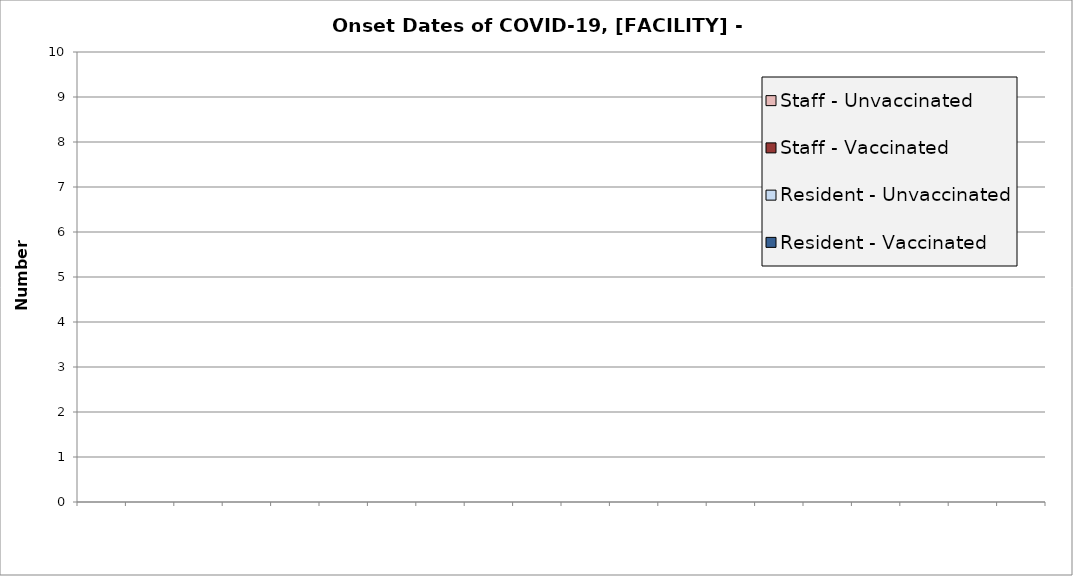
| Category | Resident - Vaccinated | Resident - Unvaccinated | Staff - Vaccinated | Staff - Unvaccinated |
|---|---|---|---|---|
|  | 0 | 0 | 0 | 0 |
|  | 0 | 0 | 0 | 0 |
|  | 0 | 0 | 0 | 0 |
|  | 0 | 0 | 0 | 0 |
|  | 0 | 0 | 0 | 0 |
|  | 0 | 0 | 0 | 0 |
|  | 0 | 0 | 0 | 0 |
|  | 0 | 0 | 0 | 0 |
|  | 0 | 0 | 0 | 0 |
|  | 0 | 0 | 0 | 0 |
|  | 0 | 0 | 0 | 0 |
|  | 0 | 0 | 0 | 0 |
|  | 0 | 0 | 0 | 0 |
|  | 0 | 0 | 0 | 0 |
|  | 0 | 0 | 0 | 0 |
|  | 0 | 0 | 0 | 0 |
|  | 0 | 0 | 0 | 0 |
|  | 0 | 0 | 0 | 0 |
|  | 0 | 0 | 0 | 0 |
|  | 0 | 0 | 0 | 0 |